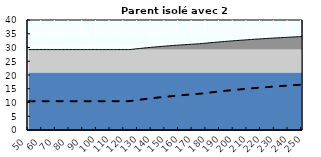
| Category | Coin fiscal moyen (somme des composantes) | Taux moyen d'imposition net en % du salaire brut |
|---|---|---|
| 50.0 | 29.249 | 10.5 |
| 51.0 | 29.249 | 10.5 |
| 52.0 | 29.249 | 10.5 |
| 53.0 | 29.249 | 10.5 |
| 54.0 | 29.249 | 10.5 |
| 55.0 | 29.249 | 10.5 |
| 56.0 | 29.249 | 10.5 |
| 57.0 | 29.249 | 10.5 |
| 58.0 | 29.249 | 10.5 |
| 59.0 | 29.249 | 10.5 |
| 60.0 | 29.249 | 10.5 |
| 61.0 | 29.249 | 10.5 |
| 62.0 | 29.249 | 10.5 |
| 63.0 | 29.249 | 10.5 |
| 64.0 | 29.249 | 10.5 |
| 65.0 | 29.249 | 10.5 |
| 66.0 | 29.249 | 10.5 |
| 67.0 | 29.249 | 10.5 |
| 68.0 | 29.249 | 10.5 |
| 69.0 | 29.249 | 10.5 |
| 70.0 | 29.249 | 10.5 |
| 71.0 | 29.249 | 10.5 |
| 72.0 | 29.249 | 10.5 |
| 73.0 | 29.249 | 10.5 |
| 74.0 | 29.249 | 10.5 |
| 75.0 | 29.249 | 10.5 |
| 76.0 | 29.249 | 10.5 |
| 77.0 | 29.249 | 10.5 |
| 78.0 | 29.249 | 10.5 |
| 79.0 | 29.249 | 10.5 |
| 80.0 | 29.249 | 10.5 |
| 81.0 | 29.249 | 10.5 |
| 82.0 | 29.249 | 10.5 |
| 83.0 | 29.249 | 10.5 |
| 84.0 | 29.249 | 10.5 |
| 85.0 | 29.249 | 10.5 |
| 86.0 | 29.249 | 10.5 |
| 87.0 | 29.249 | 10.5 |
| 88.0 | 29.249 | 10.5 |
| 89.0 | 29.249 | 10.5 |
| 90.0 | 29.249 | 10.5 |
| 91.0 | 29.249 | 10.5 |
| 92.0 | 29.249 | 10.5 |
| 93.0 | 29.249 | 10.5 |
| 94.0 | 29.249 | 10.5 |
| 95.0 | 29.249 | 10.5 |
| 96.0 | 29.249 | 10.5 |
| 97.0 | 29.249 | 10.5 |
| 98.0 | 29.249 | 10.5 |
| 99.0 | 29.249 | 10.5 |
| 100.0 | 29.249 | 10.5 |
| 101.0 | 29.249 | 10.5 |
| 102.0 | 29.249 | 10.5 |
| 103.0 | 29.249 | 10.5 |
| 104.0 | 29.249 | 10.5 |
| 105.0 | 29.249 | 10.5 |
| 106.0 | 29.249 | 10.5 |
| 107.0 | 29.249 | 10.5 |
| 108.0 | 29.249 | 10.5 |
| 109.0 | 29.249 | 10.5 |
| 110.0 | 29.249 | 10.5 |
| 111.0 | 29.249 | 10.5 |
| 112.0 | 29.249 | 10.5 |
| 113.0 | 29.249 | 10.5 |
| 114.0 | 29.249 | 10.5 |
| 115.0 | 29.249 | 10.5 |
| 116.0 | 29.249 | 10.5 |
| 117.0 | 29.249 | 10.5 |
| 118.0 | 29.249 | 10.5 |
| 119.0 | 29.249 | 10.5 |
| 120.0 | 29.249 | 10.5 |
| 121.0 | 29.249 | 10.5 |
| 122.0 | 29.249 | 10.5 |
| 123.0 | 29.249 | 10.5 |
| 124.0 | 29.254 | 10.506 |
| 125.0 | 29.312 | 10.579 |
| 126.0 | 29.369 | 10.652 |
| 127.0 | 29.425 | 10.723 |
| 128.0 | 29.48 | 10.793 |
| 129.0 | 29.535 | 10.861 |
| 130.0 | 29.588 | 10.929 |
| 131.0 | 29.641 | 10.996 |
| 132.0 | 29.693 | 11.062 |
| 133.0 | 29.744 | 11.127 |
| 134.0 | 29.795 | 11.19 |
| 135.0 | 29.845 | 11.253 |
| 136.0 | 29.893 | 11.315 |
| 137.0 | 29.942 | 11.376 |
| 138.0 | 29.989 | 11.436 |
| 139.0 | 30.036 | 11.496 |
| 140.0 | 30.082 | 11.554 |
| 141.0 | 30.128 | 11.612 |
| 142.0 | 30.173 | 11.669 |
| 143.0 | 30.217 | 11.725 |
| 144.0 | 30.261 | 11.78 |
| 145.0 | 30.304 | 11.834 |
| 146.0 | 30.346 | 11.888 |
| 147.0 | 30.388 | 11.941 |
| 148.0 | 30.429 | 11.993 |
| 149.0 | 30.47 | 12.045 |
| 150.0 | 30.51 | 12.096 |
| 151.0 | 30.55 | 12.146 |
| 152.0 | 30.589 | 12.196 |
| 153.0 | 30.628 | 12.244 |
| 154.0 | 30.666 | 12.293 |
| 155.0 | 30.704 | 12.34 |
| 156.0 | 30.741 | 12.387 |
| 157.0 | 30.778 | 12.434 |
| 158.0 | 30.814 | 12.48 |
| 159.0 | 30.85 | 12.525 |
| 160.0 | 30.885 | 12.57 |
| 161.0 | 30.92 | 12.614 |
| 162.0 | 30.954 | 12.657 |
| 163.0 | 30.989 | 12.701 |
| 164.0 | 31.022 | 12.743 |
| 165.0 | 31.055 | 12.785 |
| 166.0 | 31.088 | 12.827 |
| 167.0 | 31.121 | 12.868 |
| 168.0 | 31.153 | 12.908 |
| 169.0 | 31.184 | 12.948 |
| 170.0 | 31.216 | 12.988 |
| 171.0 | 31.247 | 13.027 |
| 172.0 | 31.277 | 13.066 |
| 173.0 | 31.307 | 13.104 |
| 174.0 | 31.337 | 13.142 |
| 175.0 | 31.367 | 13.179 |
| 176.0 | 31.409 | 13.232 |
| 177.0 | 31.458 | 13.294 |
| 178.0 | 31.507 | 13.356 |
| 179.0 | 31.555 | 13.417 |
| 180.0 | 31.602 | 13.477 |
| 181.0 | 31.65 | 13.537 |
| 182.0 | 31.696 | 13.596 |
| 183.0 | 31.742 | 13.654 |
| 184.0 | 31.788 | 13.712 |
| 185.0 | 31.833 | 13.769 |
| 186.0 | 31.878 | 13.825 |
| 187.0 | 31.922 | 13.881 |
| 188.0 | 31.965 | 13.936 |
| 189.0 | 32.009 | 13.991 |
| 190.0 | 32.051 | 14.045 |
| 191.0 | 32.094 | 14.099 |
| 192.0 | 32.136 | 14.151 |
| 193.0 | 32.177 | 14.204 |
| 194.0 | 32.218 | 14.256 |
| 195.0 | 32.259 | 14.307 |
| 196.0 | 32.299 | 14.358 |
| 197.0 | 32.339 | 14.408 |
| 198.0 | 32.378 | 14.458 |
| 199.0 | 32.417 | 14.507 |
| 200.0 | 32.455 | 14.556 |
| 201.0 | 32.494 | 14.604 |
| 202.0 | 32.531 | 14.652 |
| 203.0 | 32.569 | 14.7 |
| 204.0 | 32.606 | 14.747 |
| 205.0 | 32.643 | 14.793 |
| 206.0 | 32.679 | 14.839 |
| 207.0 | 32.715 | 14.885 |
| 208.0 | 32.751 | 14.93 |
| 209.0 | 32.786 | 14.974 |
| 210.0 | 32.821 | 15.019 |
| 211.0 | 32.856 | 15.062 |
| 212.0 | 32.89 | 15.106 |
| 213.0 | 32.924 | 15.149 |
| 214.0 | 32.958 | 15.191 |
| 215.0 | 32.991 | 15.234 |
| 216.0 | 33.024 | 15.275 |
| 217.0 | 33.057 | 15.317 |
| 218.0 | 33.089 | 15.358 |
| 219.0 | 33.121 | 15.399 |
| 220.0 | 33.153 | 15.439 |
| 221.0 | 33.185 | 15.479 |
| 222.0 | 33.216 | 15.518 |
| 223.0 | 33.247 | 15.558 |
| 224.0 | 33.278 | 15.597 |
| 225.0 | 33.308 | 15.635 |
| 226.0 | 33.339 | 15.673 |
| 227.0 | 33.369 | 15.711 |
| 228.0 | 33.398 | 15.749 |
| 229.0 | 33.428 | 15.786 |
| 230.0 | 33.457 | 15.823 |
| 231.0 | 33.486 | 15.859 |
| 232.0 | 33.514 | 15.896 |
| 233.0 | 33.543 | 15.931 |
| 234.0 | 33.571 | 15.967 |
| 235.0 | 33.599 | 16.002 |
| 236.0 | 33.626 | 16.037 |
| 237.0 | 33.654 | 16.072 |
| 238.0 | 33.681 | 16.107 |
| 239.0 | 33.708 | 16.141 |
| 240.0 | 33.735 | 16.175 |
| 241.0 | 33.761 | 16.208 |
| 242.0 | 33.788 | 16.241 |
| 243.0 | 33.814 | 16.275 |
| 244.0 | 33.84 | 16.307 |
| 245.0 | 33.865 | 16.34 |
| 246.0 | 33.891 | 16.372 |
| 247.0 | 33.916 | 16.404 |
| 248.0 | 33.941 | 16.436 |
| 249.0 | 33.966 | 16.467 |
| 250.0 | 33.991 | 16.498 |